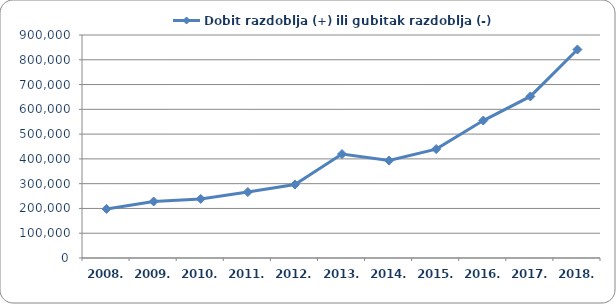
| Category | Dobit razdoblja (+) ili gubitak razdoblja (-)  |
|---|---|
| 2008. | 198044.752 |
| 2009. | 228072.006 |
| 2010. | 238355.117 |
| 2011. | 266097.543 |
| 2012. | 296409.288 |
| 2013. | 419487.616 |
| 2014. | 393230.535 |
| 2015. | 439566.494 |
| 2016. | 554743.968 |
| 2017. | 652137.742 |
| 2018. | 841376.518 |